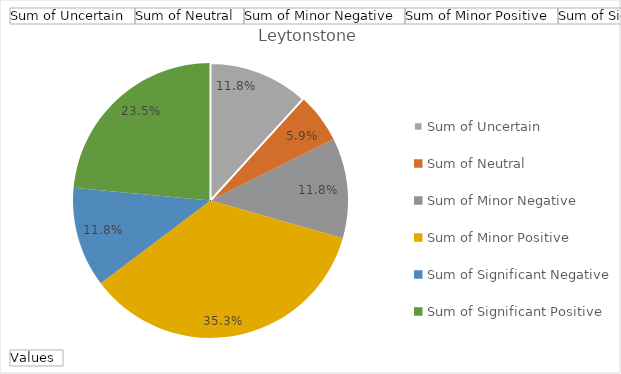
| Category | Total |
|---|---|
| Sum of Uncertain | 2 |
| Sum of Neutral | 1 |
| Sum of Minor Negative | 2 |
| Sum of Minor Positive | 6 |
| Sum of Significant Negative | 2 |
| Sum of Significant Positive | 4 |